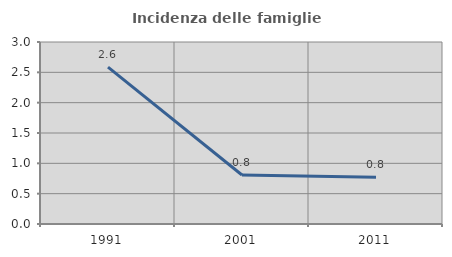
| Category | Incidenza delle famiglie numerose |
|---|---|
| 1991.0 | 2.586 |
| 2001.0 | 0.808 |
| 2011.0 | 0.769 |